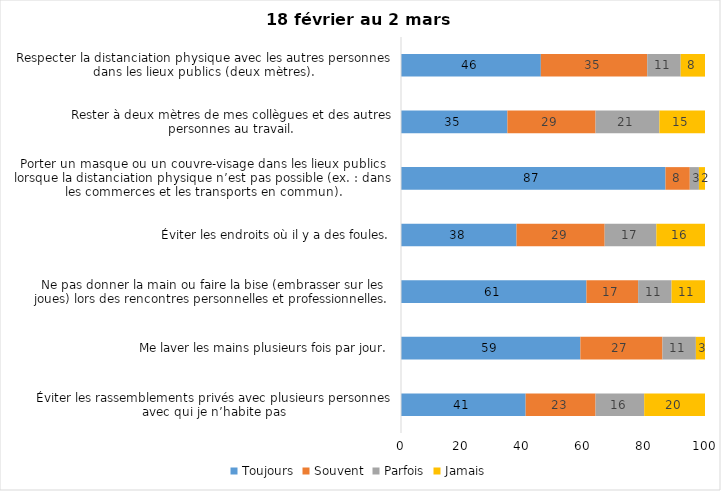
| Category | Toujours | Souvent | Parfois | Jamais |
|---|---|---|---|---|
| Éviter les rassemblements privés avec plusieurs personnes avec qui je n’habite pas | 41 | 23 | 16 | 20 |
| Me laver les mains plusieurs fois par jour. | 59 | 27 | 11 | 3 |
| Ne pas donner la main ou faire la bise (embrasser sur les joues) lors des rencontres personnelles et professionnelles. | 61 | 17 | 11 | 11 |
| Éviter les endroits où il y a des foules. | 38 | 29 | 17 | 16 |
| Porter un masque ou un couvre-visage dans les lieux publics lorsque la distanciation physique n’est pas possible (ex. : dans les commerces et les transports en commun). | 87 | 8 | 3 | 2 |
| Rester à deux mètres de mes collègues et des autres personnes au travail. | 35 | 29 | 21 | 15 |
| Respecter la distanciation physique avec les autres personnes dans les lieux publics (deux mètres). | 46 | 35 | 11 | 8 |